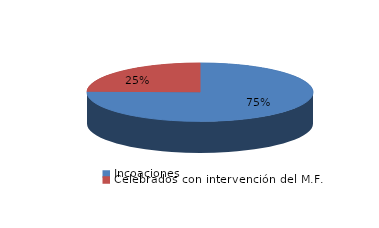
| Category | Series 0 |
|---|---|
| Incoaciones | 7303 |
| Celebrados con intervención del M.F. | 2402 |